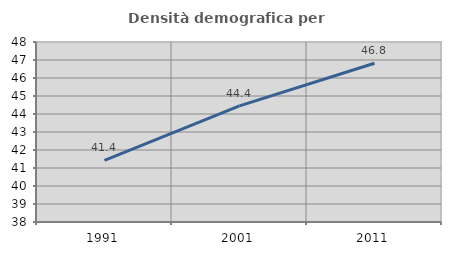
| Category | Densità demografica |
|---|---|
| 1991.0 | 41.425 |
| 2001.0 | 44.45 |
| 2011.0 | 46.817 |